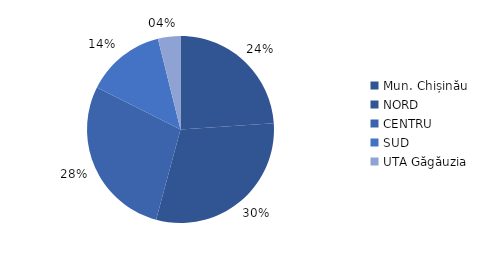
| Category | Series 0 |
|---|---|
| Mun. Chișinău | 0.239 |
| NORD | 0.303 |
| CENTRU | 0.282 |
| SUD | 0.137 |
| UTA Găgăuzia | 0.039 |